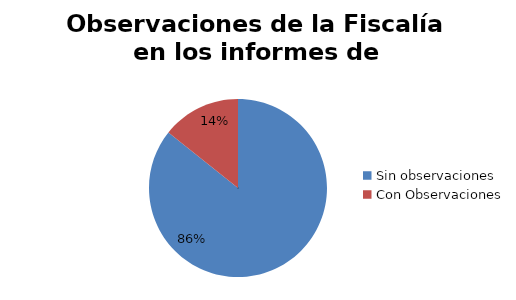
| Category | Series 0 |
|---|---|
| Sin observaciones | 30 |
| Con Observaciones | 5 |